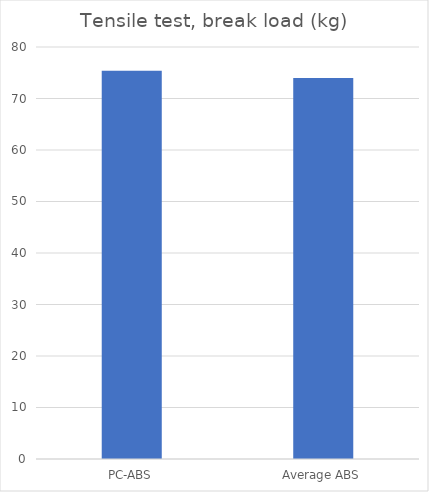
| Category | Average |
|---|---|
| PC-ABS | 75.4 |
| Average ABS | 74 |